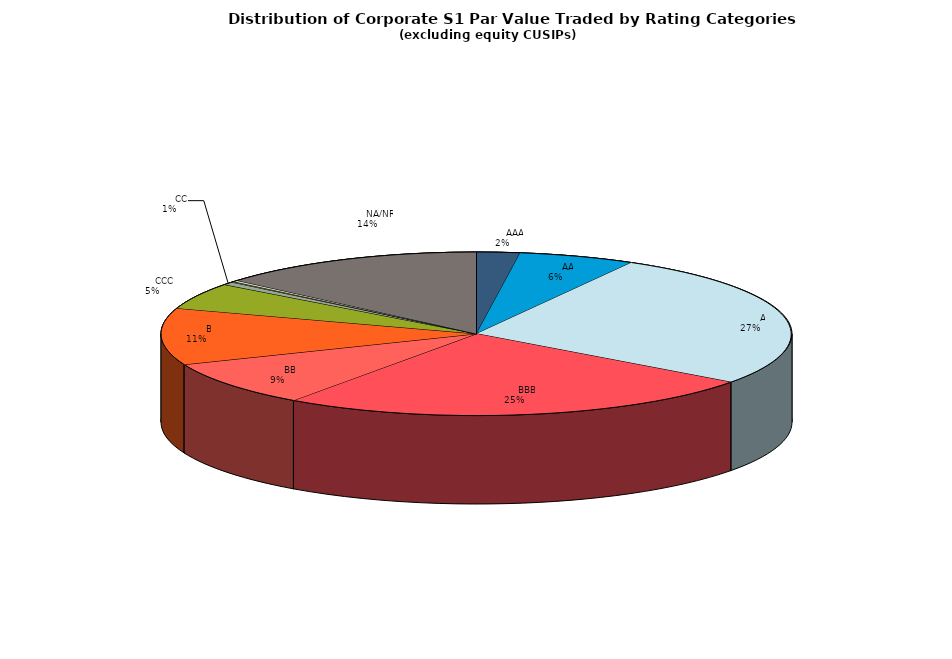
| Category | Series 0 |
|---|---|
|         AAA | 528850824.009 |
|         AA | 1424082492.141 |
|         A | 6420894447.889 |
|         BBB | 5912651295.383 |
|         BB | 2151045124.265 |
|         B | 2674881339.163 |
|         CCC | 1243720719.322 |
|         CC | 144218521.63 |
|         C | 31499825.6 |
|         D | 69706176.76 |
|         NA/NR | 3268889778.234 |